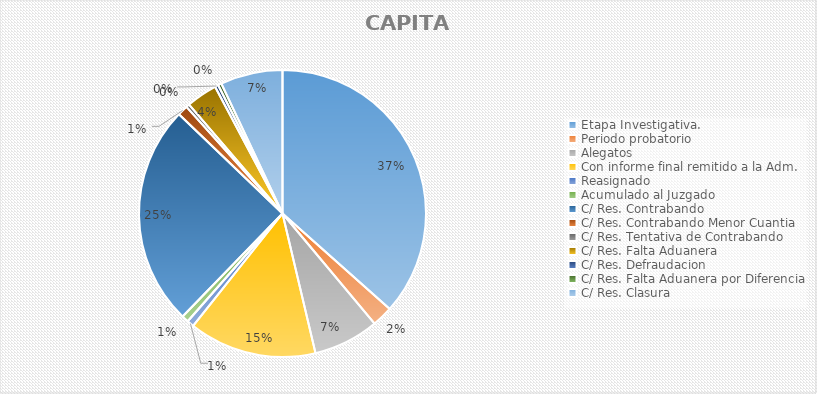
| Category | Series 1 |
|---|---|
| Etapa Investigativa. | 94 |
| Periodo probatorio | 6 |
| Alegatos | 19 |
| Con informe final remitido a la Adm. | 37 |
| Reasignado | 2 |
| Acumulado al Juzgado | 2 |
| C/ Res. Contrabando | 64 |
| C/ Res. Contrabando Menor Cuantia | 3 |
| C/ Res. Tentativa de Contrabando | 1 |
| C/ Res. Falta Aduanera | 9 |
| C/ Res. Defraudacion | 1 |
| C/ Res. Falta Aduanera por Diferencia | 1 |
| C/ Res. Clasura | 18 |